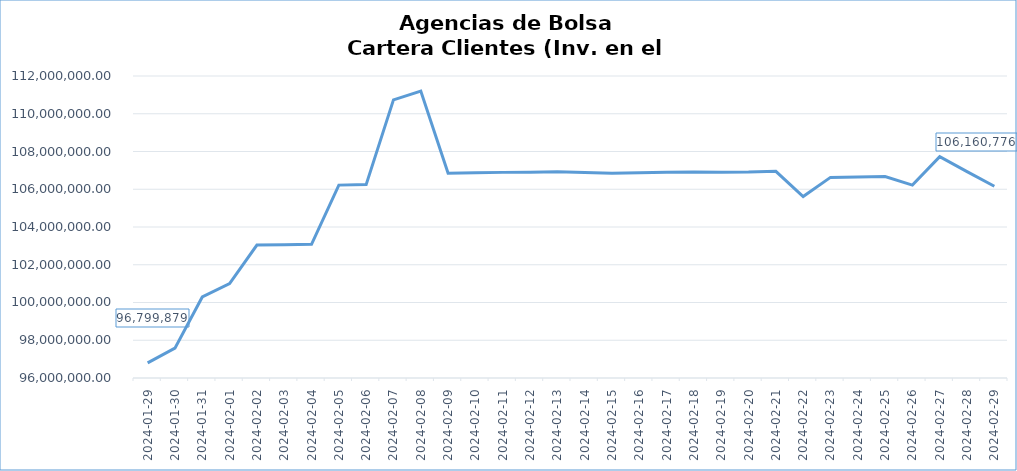
| Category | INV. EXTRANJERO |
|---|---|
| 2024-01-29 | 96799878.586 |
| 2024-01-30 | 97584708.409 |
| 2024-01-31 | 100295026.56 |
| 2024-02-01 | 101001560.806 |
| 2024-02-02 | 103041573.218 |
| 2024-02-03 | 103061364.228 |
| 2024-02-04 | 103082768.258 |
| 2024-02-05 | 106219276.137 |
| 2024-02-06 | 106247001.25 |
| 2024-02-07 | 110737939.725 |
| 2024-02-08 | 111200218.151 |
| 2024-02-09 | 106851974.972 |
| 2024-02-10 | 106873662.122 |
| 2024-02-11 | 106894045.862 |
| 2024-02-12 | 106901782.552 |
| 2024-02-13 | 106923160.282 |
| 2024-02-14 | 106891984.962 |
| 2024-02-15 | 106845379.018 |
| 2024-02-16 | 106873895.96 |
| 2024-02-17 | 106895618.49 |
| 2024-02-18 | 106915714.02 |
| 2024-02-19 | 106902833.94 |
| 2024-02-20 | 106909218.65 |
| 2024-02-21 | 106951509.755 |
| 2024-02-22 | 105611104.102 |
| 2024-02-23 | 106627939.869 |
| 2024-02-24 | 106649210.079 |
| 2024-02-25 | 106669969.019 |
| 2024-02-26 | 106216892.016 |
| 2024-02-27 | 107728134.838 |
| 2024-02-28 | 106932735.092 |
| 2024-02-29 | 106160776.311 |